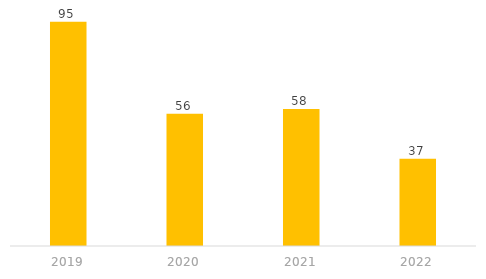
| Category | Comites de obra |
|---|---|
| 2019.0 | 95 |
| 2020.0 | 56 |
| 2021.0 | 58 |
| 2022.0 | 37 |